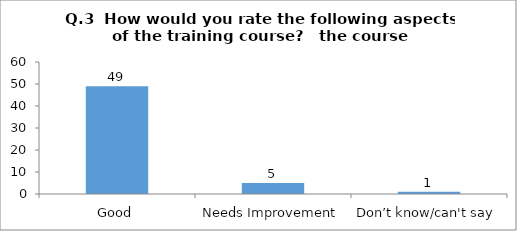
| Category | Q.3  How would you rate the following aspects of the training course?  |
|---|---|
| Good | 49 |
| Needs Improvement | 5 |
| Don’t know/can't say | 1 |